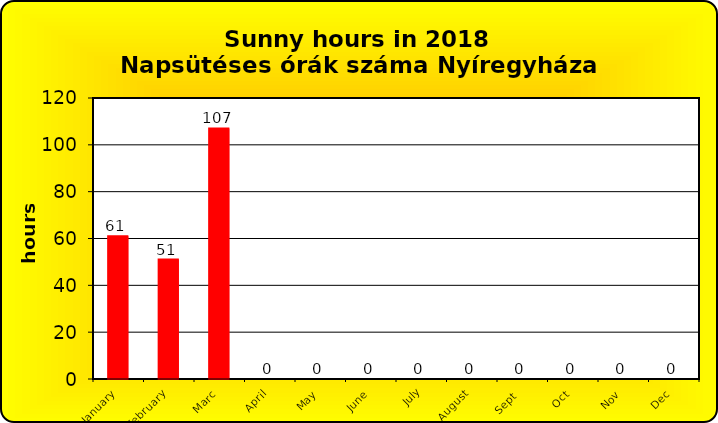
| Category | Series 0 |
|---|---|
| January | 61 |
| February | 51 |
| Marc | 107 |
| April | 0 |
| May | 0 |
| June | 0 |
| July | 0 |
| August | 0 |
| Sept  | 0 |
| Oct | 0 |
| Nov | 0 |
| Dec | 0 |